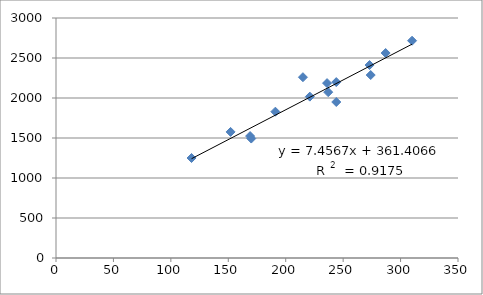
| Category | Series 0 |
|---|---|
| 221.0 | 2017 |
| 274.0 | 2287 |
| 287.0 | 2562 |
| 273.0 | 2412 |
| 310.0 | 2716 |
| 118.0 | 1250 |
| 152.0 | 1576 |
| 170.0 | 1493 |
| 169.0 | 1524 |
| 191.0 | 1829 |
| 237.0 | 2073 |
| 215.0 | 2260 |
| 236.0 | 2186 |
| 244.0 | 2199 |
| 244.0 | 1950 |